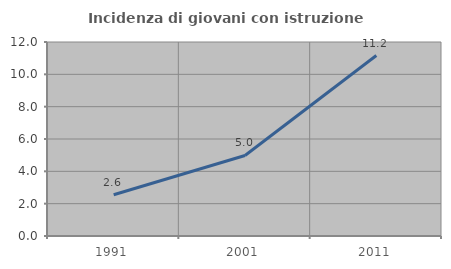
| Category | Incidenza di giovani con istruzione universitaria |
|---|---|
| 1991.0 | 2.553 |
| 2001.0 | 4.982 |
| 2011.0 | 11.163 |